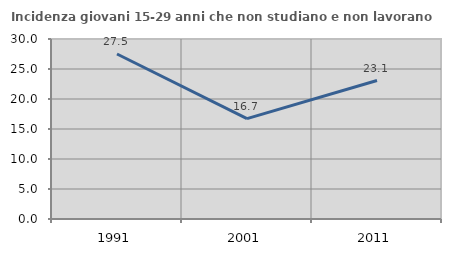
| Category | Incidenza giovani 15-29 anni che non studiano e non lavorano  |
|---|---|
| 1991.0 | 27.5 |
| 2001.0 | 16.738 |
| 2011.0 | 23.077 |